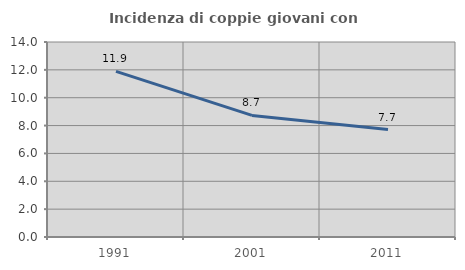
| Category | Incidenza di coppie giovani con figli |
|---|---|
| 1991.0 | 11.89 |
| 2001.0 | 8.728 |
| 2011.0 | 7.71 |